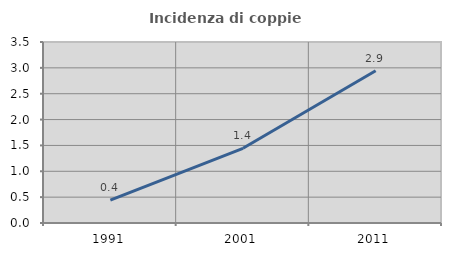
| Category | Incidenza di coppie miste |
|---|---|
| 1991.0 | 0.442 |
| 2001.0 | 1.445 |
| 2011.0 | 2.945 |